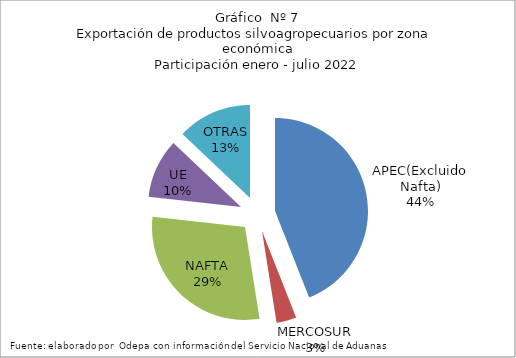
| Category | Series 0 |
|---|---|
| APEC(Excluido Nafta) | 5227377.971 |
| MERCOSUR | 412543.543 |
| NAFTA | 3475156.095 |
| UE | 1222860.052 |
| OTRAS | 1537193.339 |